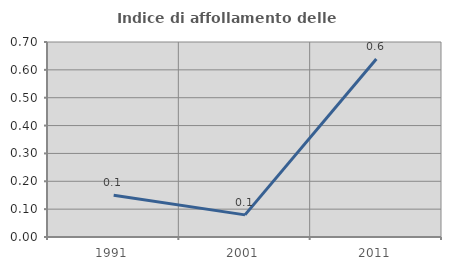
| Category | Indice di affollamento delle abitazioni  |
|---|---|
| 1991.0 | 0.15 |
| 2001.0 | 0.079 |
| 2011.0 | 0.639 |